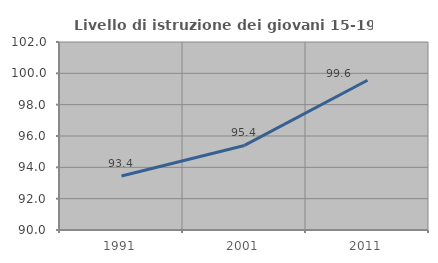
| Category | Livello di istruzione dei giovani 15-19 anni |
|---|---|
| 1991.0 | 93.443 |
| 2001.0 | 95.397 |
| 2011.0 | 99.558 |